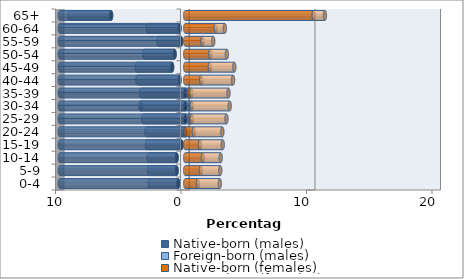
| Category | Native-born (males) | Foreign-born (males) | Native-born (females) | Foreign-born (females) |
|---|---|---|---|---|
| 0-4 | -0.558 | -2.265 | 1.018 | 1.74 |
| 5-9 | -0.689 | -2.2 | 1.248 | 1.543 |
| 10-14 | -0.689 | -2.232 | 1.412 | 1.412 |
| 15-19 | -0.295 | -2.758 | 1.182 | 1.806 |
| 20-24 | 0.033 | -3.086 | 0.657 | 2.265 |
| 25-29 | 0.394 | -3.349 | 0.131 | 2.758 |
| 30-34 | 0.525 | -3.48 | -0.098 | 3.02 |
| 35-39 | 0.263 | -3.513 | 0.23 | 2.955 |
| 40-44 | -0.46 | -3.349 | 1.28 | 2.528 |
| 45-49 | -1.051 | -2.823 | 1.97 | 1.937 |
| 50-54 | -0.854 | -2.397 | 2.003 | 1.313 |
| 55-59 | -0.328 | -1.806 | 1.379 | 0.854 |
| 60-64 | -0.46 | -2.528 | 2.429 | 0.722 |
| 65+ | -5.909 | -3.316 | 10.243 | 0.886 |